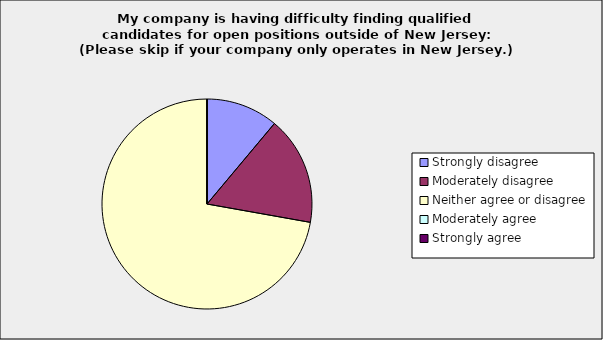
| Category | Series 0 |
|---|---|
| Strongly disagree | 0.111 |
| Moderately disagree | 0.167 |
| Neither agree or disagree | 0.722 |
| Moderately agree | 0 |
| Strongly agree | 0 |